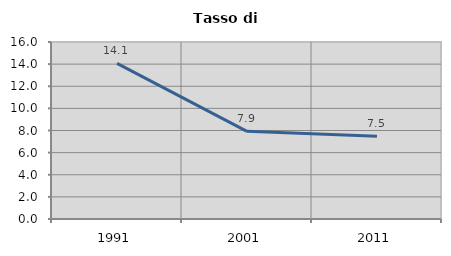
| Category | Tasso di disoccupazione   |
|---|---|
| 1991.0 | 14.062 |
| 2001.0 | 7.926 |
| 2011.0 | 7.487 |